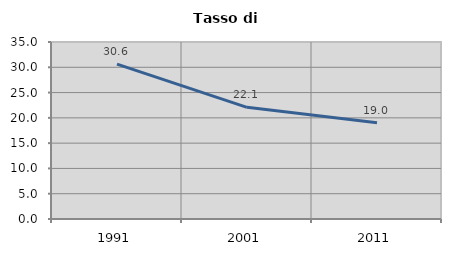
| Category | Tasso di disoccupazione   |
|---|---|
| 1991.0 | 30.629 |
| 2001.0 | 22.077 |
| 2011.0 | 19.038 |